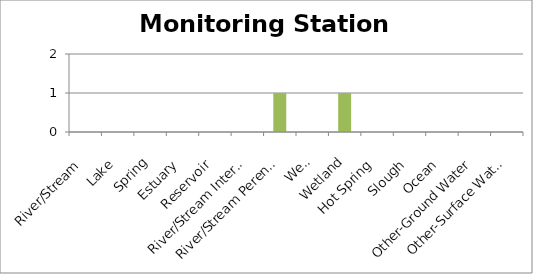
| Category | Monitoring Station Count |
|---|---|
| River/Stream | 0 |
| Lake | 0 |
| Spring | 0 |
| Estuary | 0 |
| Reservoir | 0 |
| River/Stream Intermittent | 0 |
| River/Stream Perennial | 1 |
| Well | 0 |
| Wetland | 1 |
| Hot Spring | 0 |
| Slough | 0 |
| Ocean | 0 |
| Other-Ground Water | 0 |
| Other-Surface Water | 0 |